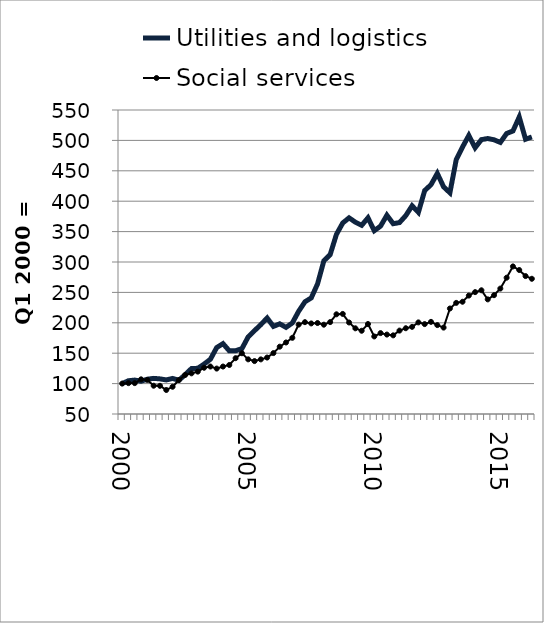
| Category | Utilities and logistics | Social services |
|---|---|---|
| 2000.0 | 100 | 100 |
| nan | 104.696 | 100.757 |
| nan | 105.78 | 100.798 |
| nan | 103.923 | 107.002 |
| 2001.0 | 107.233 | 106.055 |
| nan | 108.588 | 96.522 |
| nan | 107.774 | 96.368 |
| nan | 106.042 | 89.524 |
| 2002.0 | 108.473 | 94.825 |
| nan | 105.532 | 105.82 |
| nan | 114.671 | 114.246 |
| nan | 124.7 | 116.891 |
| 2003.0 | 125.164 | 119.687 |
| nan | 132.091 | 126.085 |
| nan | 140.013 | 128.095 |
| nan | 159.26 | 124.718 |
| 2004.0 | 165.731 | 128.05 |
| nan | 153.878 | 130.612 |
| nan | 154.021 | 141.799 |
| nan | 157.49 | 149.925 |
| 2005.0 | 176.925 | 139.899 |
| nan | 187.094 | 137.05 |
| nan | 196.921 | 139.84 |
| nan | 207.871 | 142.846 |
| 2006.0 | 194.103 | 150.204 |
| nan | 198.314 | 160.718 |
| nan | 192.483 | 167.647 |
| nan | 199.725 | 175.322 |
| 2007.0 | 218.91 | 197.032 |
| nan | 234.53 | 201.06 |
| nan | 240.954 | 198.965 |
| nan | 263.935 | 199.626 |
| 2008.0 | 301.887 | 196.888 |
| nan | 312.125 | 201.161 |
| nan | 345.512 | 213.969 |
| nan | 364.188 | 214.604 |
| 2009.0 | 372.617 | 200.506 |
| nan | 365.516 | 190.922 |
| nan | 360.331 | 186.905 |
| nan | 372.62 | 197.999 |
| 2010.0 | 351.46 | 177.556 |
| nan | 359.061 | 183.046 |
| nan | 376.943 | 180.645 |
| nan | 363.012 | 179.363 |
| 2011.0 | 364.805 | 187.178 |
| nan | 376.305 | 191.072 |
| nan | 392.412 | 193.311 |
| nan | 381.674 | 200.658 |
| 2012.0 | 417.499 | 197.859 |
| nan | 427.148 | 201.54 |
| nan | 445.724 | 196.239 |
| nan | 423.598 | 192.126 |
| 2013.0 | 413.88 | 223.508 |
| nan | 468.169 | 232.755 |
| nan | 489.061 | 234.621 |
| nan | 508.073 | 244.782 |
| 2014.0 | 487.923 | 250.462 |
| nan | 501.273 | 253.483 |
| nan | 503.081 | 238.531 |
| nan | 500.987 | 245.404 |
| 2015.0 | 496.677 | 256.299 |
| nan | 511.34 | 274.201 |
| nan | 515.479 | 292.733 |
| nan | 538.46 | 286.805 |
| 2016.0 | 501.918 | 276.858 |
| nan | 505.627 | 272.405 |